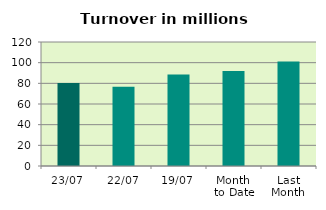
| Category | Series 0 |
|---|---|
| 23/07 | 80.367 |
| 22/07 | 76.656 |
| 19/07 | 88.604 |
| Month 
to Date | 91.833 |
| Last
Month | 101.166 |